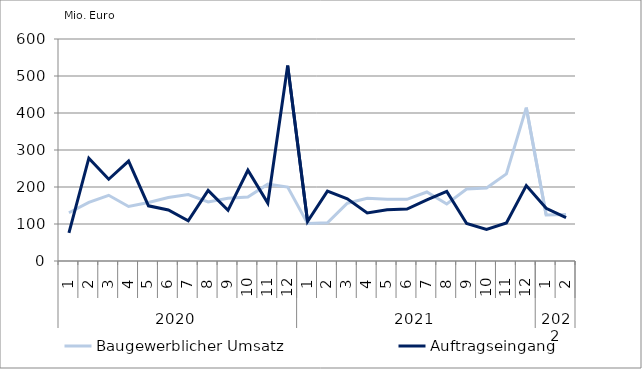
| Category | Baugewerblicher Umsatz | Auftragseingang |
|---|---|---|
| 0 | 130445.562 | 75891.481 |
| 1 | 158433.655 | 277923.85 |
| 2 | 177529.832 | 220973.626 |
| 3 | 147259.799 | 269936.091 |
| 4 | 157965.891 | 149072.895 |
| 5 | 171647.778 | 137984.76 |
| 6 | 179530.732 | 108645.965 |
| 7 | 159480.457 | 190771.468 |
| 8 | 169638.111 | 136988.906 |
| 9 | 173040.053 | 245341.603 |
| 10 | 207619.085 | 156647.224 |
| 11 | 199947.086 | 528166.004 |
| 12 | 101295.895 | 106850.127 |
| 13 | 103236.543 | 188883.434 |
| 14 | 156172.725 | 168204.42 |
| 15 | 169257.088 | 130052.073 |
| 16 | 166897.821 | 138492.214 |
| 17 | 166720.216 | 140262.426 |
| 18 | 186515.191 | 165331.191 |
| 19 | 154188.941 | 188169.655 |
| 20 | 194464.12 | 101359.538 |
| 21 | 197281.201 | 85626.862 |
| 22 | 235325.083 | 102880.924 |
| 23 | 414469.471 | 203900.676 |
| 24 | 124217.549 | 142351.759 |
| 25 | 125619.696 | 117194.423 |